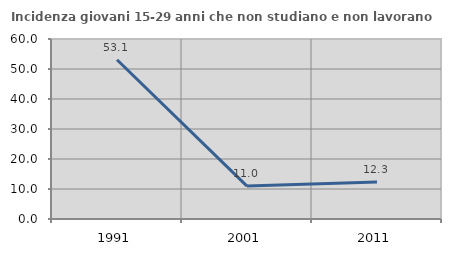
| Category | Incidenza giovani 15-29 anni che non studiano e non lavorano  |
|---|---|
| 1991.0 | 53.086 |
| 2001.0 | 10.973 |
| 2011.0 | 12.329 |